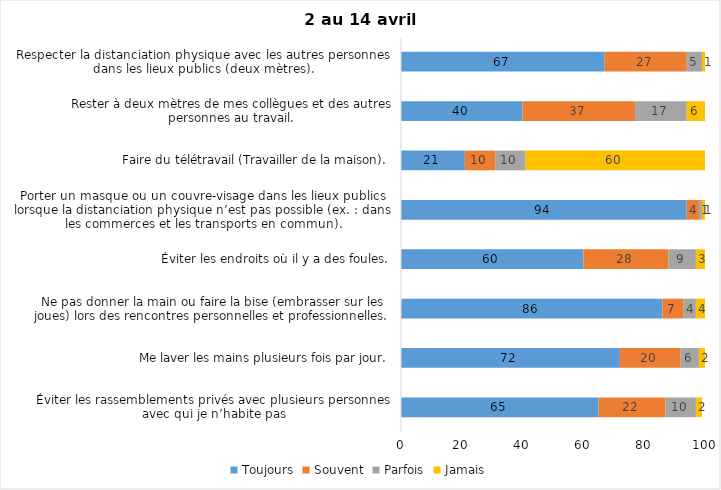
| Category | Toujours | Souvent | Parfois | Jamais |
|---|---|---|---|---|
| Éviter les rassemblements privés avec plusieurs personnes avec qui je n’habite pas | 65 | 22 | 10 | 2 |
| Me laver les mains plusieurs fois par jour. | 72 | 20 | 6 | 2 |
| Ne pas donner la main ou faire la bise (embrasser sur les joues) lors des rencontres personnelles et professionnelles. | 86 | 7 | 4 | 4 |
| Éviter les endroits où il y a des foules. | 60 | 28 | 9 | 3 |
| Porter un masque ou un couvre-visage dans les lieux publics lorsque la distanciation physique n’est pas possible (ex. : dans les commerces et les transports en commun). | 94 | 4 | 1 | 1 |
| Faire du télétravail (Travailler de la maison). | 21 | 10 | 10 | 60 |
| Rester à deux mètres de mes collègues et des autres personnes au travail. | 40 | 37 | 17 | 6 |
| Respecter la distanciation physique avec les autres personnes dans les lieux publics (deux mètres). | 67 | 27 | 5 | 1 |